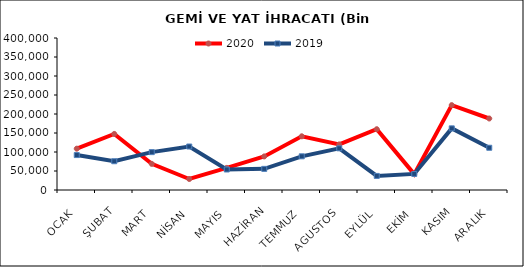
| Category | 2020 | 2019 |
|---|---|---|
| OCAK | 108751.995 | 91906.762 |
| ŞUBAT | 147559.765 | 75710.984 |
| MART | 68797.787 | 99641.453 |
| NİSAN | 28953.639 | 114410.345 |
| MAYIS | 58162.571 | 53978.743 |
| HAZİRAN | 88349.361 | 55620.229 |
| TEMMUZ | 141332.838 | 88616.06 |
| AGUSTOS | 120028.256 | 109692.736 |
| EYLÜL | 159923.622 | 37060.896 |
| EKİM | 41729.864 | 42330.466 |
| KASIM | 223265.957 | 162195.853 |
| ARALIK | 188150.699 | 111149.645 |